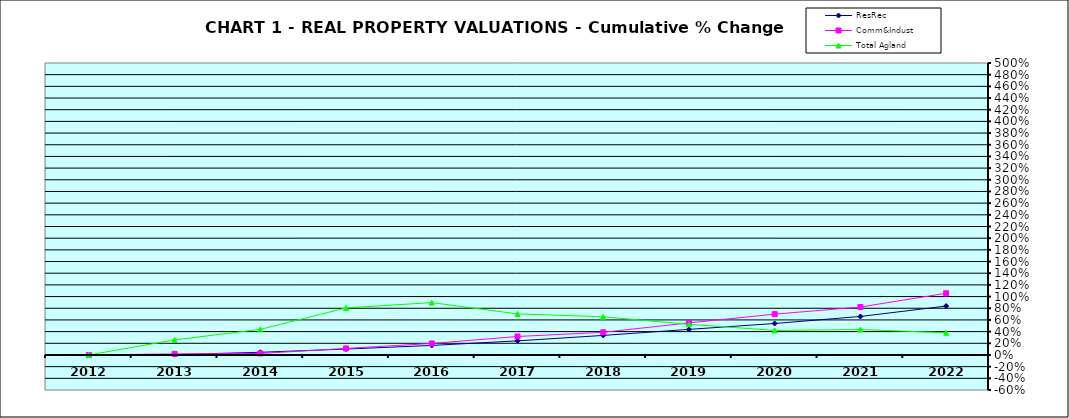
| Category | ResRec | Comm&Indust | Total Agland |
|---|---|---|---|
| 2012.0 | 0 | 0 | 0 |
| 2013.0 | 0.006 | 0.018 | 0.258 |
| 2014.0 | 0.046 | 0.026 | 0.438 |
| 2015.0 | 0.101 | 0.112 | 0.805 |
| 2016.0 | 0.163 | 0.197 | 0.897 |
| 2017.0 | 0.241 | 0.316 | 0.703 |
| 2018.0 | 0.335 | 0.388 | 0.654 |
| 2019.0 | 0.438 | 0.549 | 0.525 |
| 2020.0 | 0.539 | 0.699 | 0.42 |
| 2021.0 | 0.659 | 0.821 | 0.436 |
| 2022.0 | 0.838 | 1.057 | 0.38 |